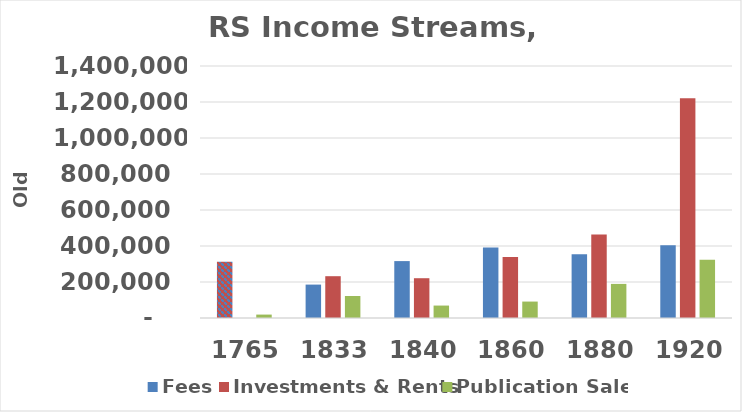
| Category | Fees | Investments & Rents | Publication Sales |
|---|---|---|---|
| 1765.0 | 312401 | 0 | 18960 |
| 1833.0 | 185610 | 232238 | 122130 |
| 1840.0 | 316128 | 221029 | 69108 |
| 1860.0 | 392208 | 339305 | 91296 |
| 1880.0 | 354000 | 464251 | 189498 |
| 1920.0 | 404054 | 1221299 | 324264 |